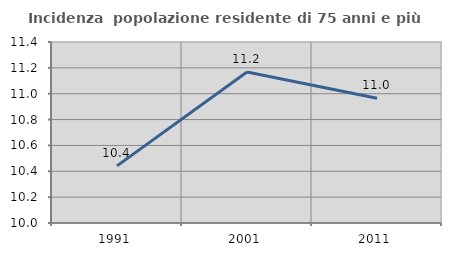
| Category | Incidenza  popolazione residente di 75 anni e più |
|---|---|
| 1991.0 | 10.442 |
| 2001.0 | 11.168 |
| 2011.0 | 10.965 |